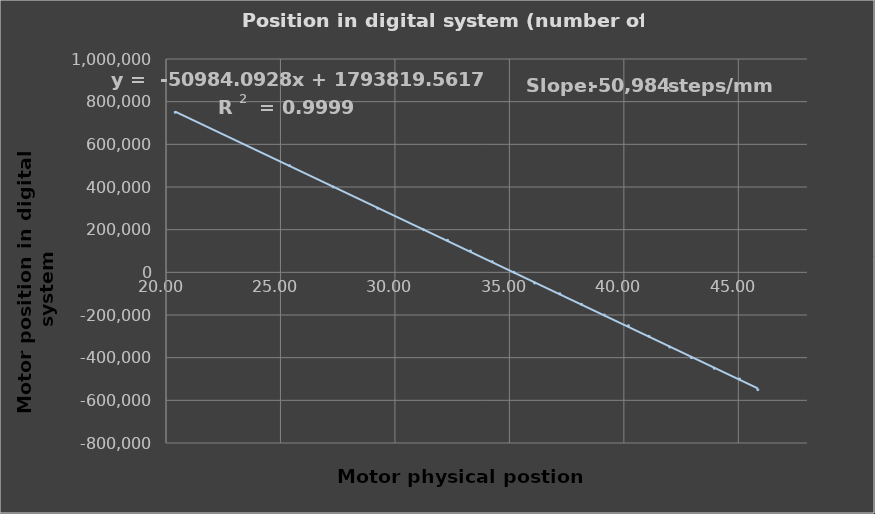
| Category | Position in digital system (number of steps) |
|---|---|
| 45.85 | -550000 |
| 45.05 | -500000 |
| 43.95 | -450000 |
| 42.95 | -400000 |
| 42.0 | -350000 |
| 41.1 | -300000 |
| 40.2 | -250000 |
| 39.15 | -200000 |
| 38.15 | -150000 |
| 37.2 | -100000 |
| 36.1 | -50000 |
| 35.2 | 0 |
| 34.25 | 50000 |
| 33.3 | 100000 |
| 32.3 | 150000 |
| 31.25 | 200000 |
| 29.25 | 300000 |
| 27.3 | 400000 |
| 25.4 | 500000 |
| 20.4 | 750000 |